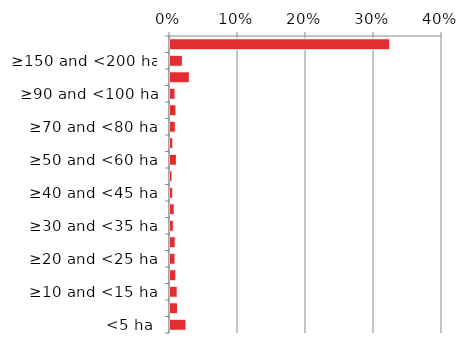
| Category | Non native |
|---|---|
| <5 ha | 0.024 |
| ≥5 and <10 ha | 0.011 |
| ≥10 and <15 ha | 0.011 |
| ≥15 and <20 ha | 0.009 |
| ≥20 and <25 ha | 0.007 |
| ≥25 and <30 ha | 0.008 |
| ≥30 and <35 ha | 0.005 |
| ≥35 and <40 ha | 0.006 |
| ≥40 and <45 ha | 0.004 |
| ≥45 and <50 ha | 0.003 |
| ≥50 and <60 ha | 0.009 |
| ≥60 and <70 ha | 0.004 |
| ≥70 and <80 ha | 0.008 |
| ≥80 and <90 ha | 0.009 |
| ≥90 and <100 ha | 0.007 |
| ≥100 and <150 ha | 0.028 |
| ≥150 and <200 ha | 0.018 |
| ≥200 ha | 0.323 |